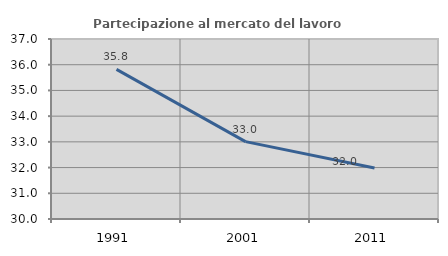
| Category | Partecipazione al mercato del lavoro  femminile |
|---|---|
| 1991.0 | 35.821 |
| 2001.0 | 33.01 |
| 2011.0 | 31.98 |